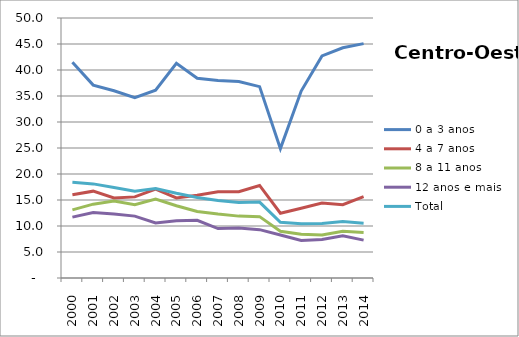
| Category | 0 a 3 anos | 4 a 7 anos | 8 a 11 anos | 12 anos e mais | Total |
|---|---|---|---|---|---|
| 2000.0 | 41.5 | 16 | 13.1 | 11.7 | 18.4 |
| 2001.0 | 37.1 | 16.7 | 14.2 | 12.6 | 18.1 |
| 2002.0 | 36 | 15.4 | 14.8 | 12.3 | 17.4 |
| 2003.0 | 34.7 | 15.6 | 14.1 | 11.9 | 16.7 |
| 2004.0 | 36.1 | 17.1 | 15.2 | 10.6 | 17.2 |
| 2005.0 | 41.3 | 15.4 | 13.9 | 11 | 16.3 |
| 2006.0 | 38.4 | 15.9 | 12.8 | 11.1 | 15.5 |
| 2007.0 | 38 | 16.6 | 12.3 | 9.5 | 14.9 |
| 2008.0 | 37.8 | 16.6 | 11.9 | 9.6 | 14.5 |
| 2009.0 | 36.8 | 17.8 | 11.8 | 9.3 | 14.6 |
| 2010.0 | 24.879 | 12.464 | 8.997 | 8.268 | 10.723 |
| 2011.0 | 35.943 | 13.421 | 8.417 | 7.223 | 10.452 |
| 2012.0 | 42.71 | 14.425 | 8.275 | 7.394 | 10.492 |
| 2013.0 | 44.27 | 14.108 | 8.985 | 8.134 | 10.844 |
| 2014.0 | 45.07 | 15.653 | 8.756 | 7.285 | 10.552 |